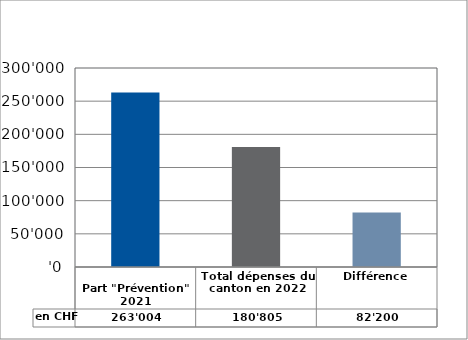
| Category | en CHF |
|---|---|
| 
Part "Prévention" 2021

 | 263004.45 |
| Total dépenses du canton en 2022 | 180804.8 |
| Différence | 82199.65 |